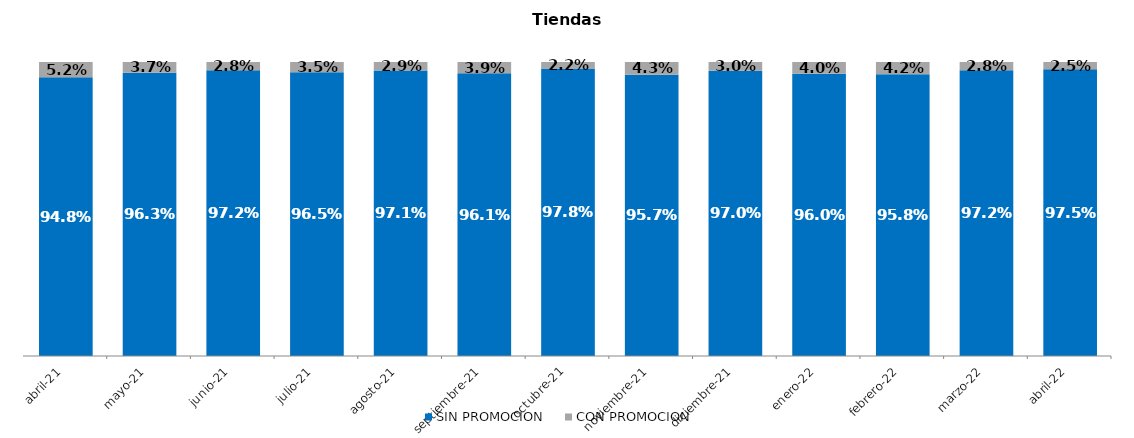
| Category | SIN PROMOCION   | CON PROMOCION   |
|---|---|---|
| 2021-04-01 | 0.948 | 0.052 |
| 2021-05-01 | 0.963 | 0.037 |
| 2021-06-01 | 0.972 | 0.028 |
| 2021-07-01 | 0.965 | 0.035 |
| 2021-08-01 | 0.971 | 0.029 |
| 2021-09-01 | 0.961 | 0.039 |
| 2021-10-01 | 0.978 | 0.022 |
| 2021-11-01 | 0.957 | 0.043 |
| 2021-12-01 | 0.97 | 0.03 |
| 2022-01-01 | 0.96 | 0.04 |
| 2022-02-01 | 0.958 | 0.042 |
| 2022-03-01 | 0.972 | 0.028 |
| 2022-04-01 | 0.975 | 0.025 |